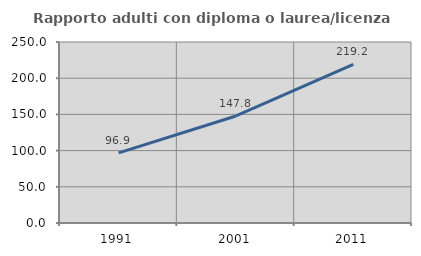
| Category | Rapporto adulti con diploma o laurea/licenza media  |
|---|---|
| 1991.0 | 96.906 |
| 2001.0 | 147.821 |
| 2011.0 | 219.245 |